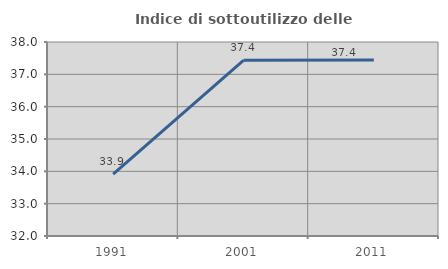
| Category | Indice di sottoutilizzo delle abitazioni  |
|---|---|
| 1991.0 | 33.914 |
| 2001.0 | 37.434 |
| 2011.0 | 37.444 |